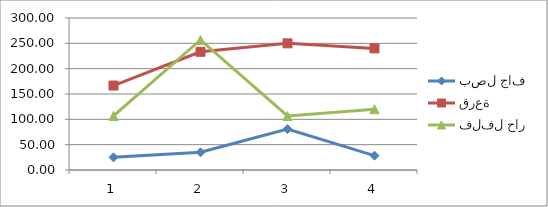
| Category | بصل جاف | قرعة | فلفل حار |
|---|---|---|---|
| 0 | 25 | 166.67 | 106.67 |
| 1 | 35 | 233.33 | 256.67 |
| 2 | 80.83 | 250 | 106.67 |
| 3 | 28.33 | 240 | 120 |